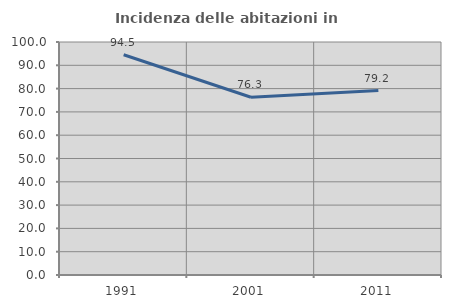
| Category | Incidenza delle abitazioni in proprietà  |
|---|---|
| 1991.0 | 94.545 |
| 2001.0 | 76.305 |
| 2011.0 | 79.167 |